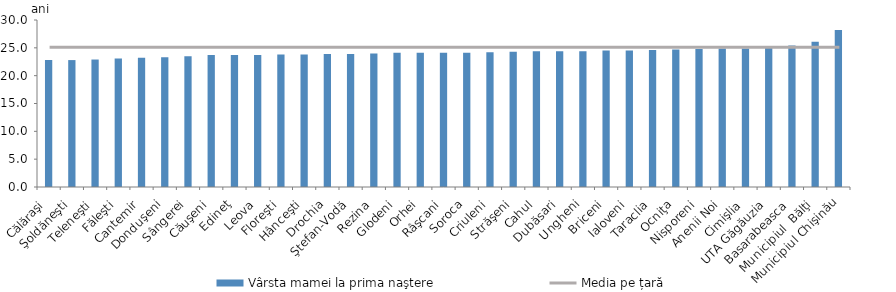
| Category | Vârsta mamei la prima naştere |
|---|---|
| Călăraşi | 22.8 |
| Şoldăneşti | 22.8 |
| Teleneşti | 22.9 |
| Făleşti | 23.1 |
| Cantemir | 23.2 |
| Donduşeni | 23.3 |
| Sângerei | 23.5 |
| Căuşeni | 23.7 |
| Edineţ | 23.7 |
| Leova | 23.7 |
| Floreşti | 23.8 |
| Hânceşti | 23.8 |
| Drochia | 23.9 |
| Ştefan-Vodă | 23.9 |
| Rezina | 24 |
| Glodeni | 24.1 |
| Orhei | 24.1 |
| Râşcani | 24.1 |
| Soroca | 24.1 |
| Criuleni | 24.2 |
| Străşeni | 24.3 |
| Cahul | 24.4 |
| Dubăsari | 24.4 |
| Ungheni | 24.4 |
| Briceni | 24.5 |
| Ialoveni | 24.5 |
| Taraclia | 24.6 |
| Ocniţa | 24.7 |
| Nisporeni | 24.8 |
| Anenii Noi | 24.9 |
| Cimişlia | 24.9 |
| UTA Găgăuzia | 25.1 |
| Basarabeasca | 25.4 |
| Municipiul  Bălţi | 26.1 |
| Municipiul Chişinău | 28.2 |